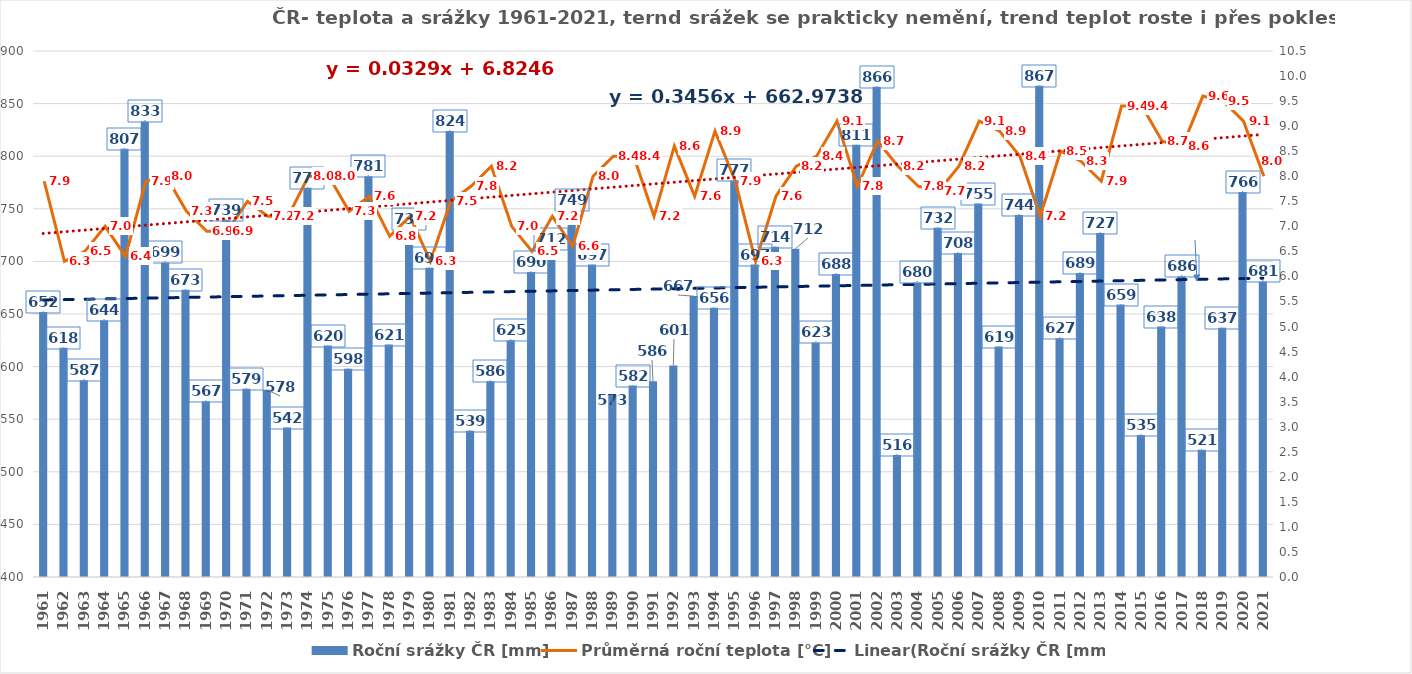
| Category | Roční srážky ČR [mm] |
|---|---|
| 1961.0 | 652 |
| 1962.0 | 618 |
| 1963.0 | 587 |
| 1964.0 | 644 |
| 1965.0 | 807 |
| 1966.0 | 833 |
| 1967.0 | 699 |
| 1968.0 | 673 |
| 1969.0 | 567 |
| 1970.0 | 739 |
| 1971.0 | 579 |
| 1972.0 | 578 |
| 1973.0 | 542 |
| 1974.0 | 770 |
| 1975.0 | 620 |
| 1976.0 | 598 |
| 1977.0 | 781 |
| 1978.0 | 621 |
| 1979.0 | 731 |
| 1980.0 | 694 |
| 1981.0 | 824 |
| 1982.0 | 539 |
| 1983.0 | 586 |
| 1984.0 | 625 |
| 1985.0 | 690 |
| 1986.0 | 712 |
| 1987.0 | 749 |
| 1988.0 | 697 |
| 1989.0 | 573 |
| 1990.0 | 582 |
| 1991.0 | 586 |
| 1992.0 | 601 |
| 1993.0 | 667 |
| 1994.0 | 656 |
| 1995.0 | 777 |
| 1996.0 | 697 |
| 1997.0 | 714 |
| 1998.0 | 712 |
| 1999.0 | 623 |
| 2000.0 | 688 |
| 2001.0 | 811 |
| 2002.0 | 866 |
| 2003.0 | 516 |
| 2004.0 | 680 |
| 2005.0 | 732 |
| 2006.0 | 708 |
| 2007.0 | 755 |
| 2008.0 | 619 |
| 2009.0 | 744 |
| 2010.0 | 867 |
| 2011.0 | 627 |
| 2012.0 | 689 |
| 2013.0 | 727 |
| 2014.0 | 659 |
| 2015.0 | 535 |
| 2016.0 | 638 |
| 2017.0 | 686 |
| 2018.0 | 521 |
| 2019.0 | 637 |
| 2020.0 | 766 |
| 2021.0 | 681 |